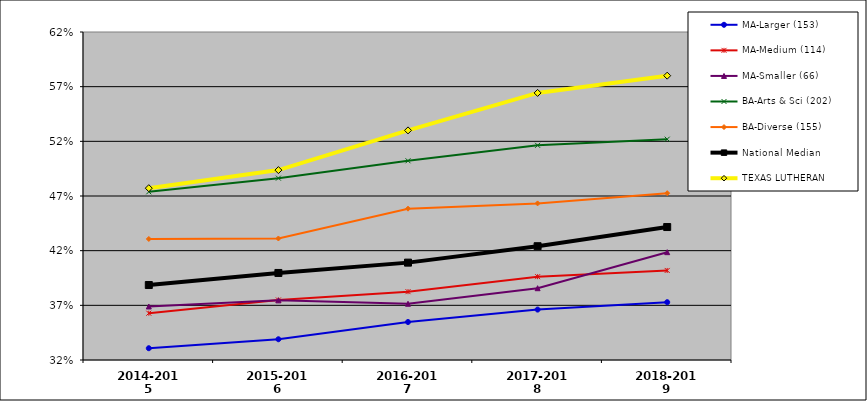
| Category | MA-Larger (153) | MA-Medium (114) | MA-Smaller (66) | BA-Arts & Sci (202) | BA-Diverse (155) | National Median | TEXAS LUTHERAN |
|---|---|---|---|---|---|---|---|
| 2014-2015 | 0.331 | 0.363 | 0.369 | 0.474 | 0.431 | 0.389 | 0.477 |
| 2015-2016 | 0.339 | 0.375 | 0.375 | 0.486 | 0.431 | 0.4 | 0.494 |
| 2016-2017 | 0.355 | 0.382 | 0.371 | 0.502 | 0.458 | 0.409 | 0.53 |
| 2017-2018 | 0.366 | 0.396 | 0.386 | 0.516 | 0.463 | 0.424 | 0.564 |
| 2018-2019 | 0.373 | 0.402 | 0.419 | 0.522 | 0.473 | 0.442 | 0.58 |